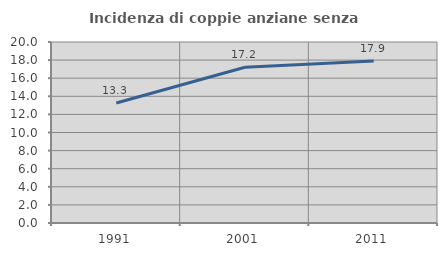
| Category | Incidenza di coppie anziane senza figli  |
|---|---|
| 1991.0 | 13.263 |
| 2001.0 | 17.204 |
| 2011.0 | 17.914 |